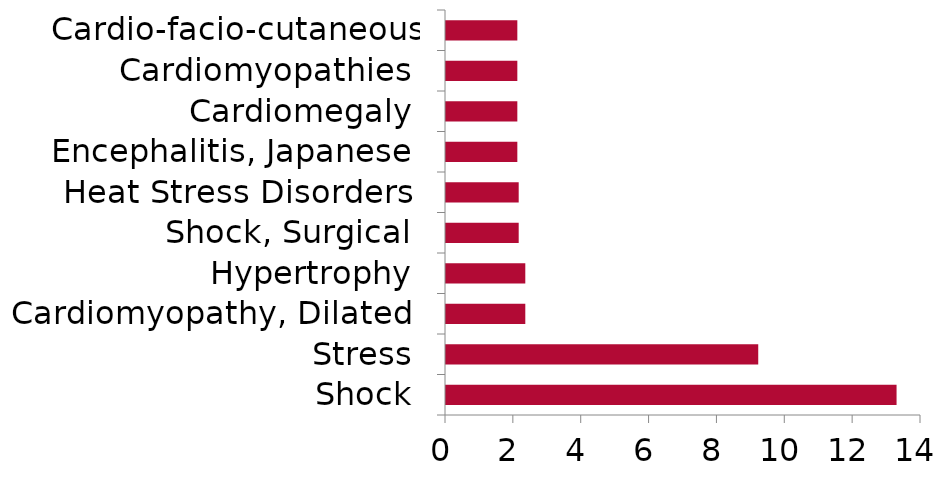
| Category | Series 0 |
|---|---|
| Shock | 13.28 |
| Stress | 9.203 |
| Cardiomyopathy, Dilated | 2.337 |
| Hypertrophy | 2.337 |
| Shock, Surgical | 2.143 |
| Heat Stress Disorders | 2.143 |
| Encephalitis, Japanese | 2.102 |
| Cardiomegaly | 2.102 |
| Cardiomyopathies | 2.102 |
| Cardio-facio-cutaneous Syndrome | 2.102 |